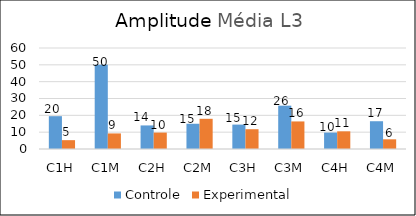
| Category | Controle | Experimental  |
|---|---|---|
| C1H | 19.5 | 5.25 |
| C1M | 50 | 9.25 |
| C2H | 14 | 9.75 |
| C2M | 15 | 17.938 |
| C3H | 14.5 | 11.75 |
| C3M | 25.75 | 16.375 |
| C4H | 9.75 | 10.5 |
| C4M | 16.5 | 5.75 |